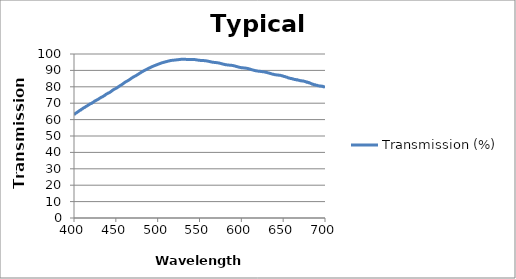
| Category | Transmission (%) |
|---|---|
| 400.0 | 63.127 |
| 401.0 | 63.377 |
| 402.0 | 63.909 |
| 403.0 | 64.16 |
| 404.0 | 64.548 |
| 405.0 | 64.884 |
| 406.0 | 65.27 |
| 407.0 | 65.632 |
| 408.0 | 65.803 |
| 409.0 | 66.292 |
| 410.0 | 66.547 |
| 411.0 | 66.97 |
| 412.0 | 67.303 |
| 413.0 | 67.467 |
| 414.0 | 67.897 |
| 415.0 | 68.181 |
| 416.0 | 68.449 |
| 417.0 | 68.894 |
| 418.0 | 69.125 |
| 419.0 | 69.527 |
| 420.0 | 69.747 |
| 421.0 | 69.894 |
| 422.0 | 70.323 |
| 423.0 | 70.546 |
| 424.0 | 70.991 |
| 425.0 | 71.37 |
| 426.0 | 71.569 |
| 427.0 | 71.92 |
| 428.0 | 72.117 |
| 429.0 | 72.42 |
| 430.0 | 72.76 |
| 431.0 | 73.118 |
| 432.0 | 73.391 |
| 433.0 | 73.743 |
| 434.0 | 73.898 |
| 435.0 | 74.228 |
| 436.0 | 74.546 |
| 437.0 | 74.881 |
| 438.0 | 75.319 |
| 439.0 | 75.653 |
| 440.0 | 75.895 |
| 441.0 | 76.187 |
| 442.0 | 76.399 |
| 443.0 | 76.68 |
| 444.0 | 77.045 |
| 445.0 | 77.421 |
| 446.0 | 77.832 |
| 447.0 | 78.191 |
| 448.0 | 78.493 |
| 449.0 | 78.727 |
| 450.0 | 78.994 |
| 451.0 | 79.269 |
| 452.0 | 79.621 |
| 453.0 | 79.962 |
| 454.0 | 80.346 |
| 455.0 | 80.67 |
| 456.0 | 80.975 |
| 457.0 | 81.298 |
| 458.0 | 81.625 |
| 459.0 | 82.017 |
| 460.0 | 82.39 |
| 461.0 | 82.779 |
| 462.0 | 83.099 |
| 463.0 | 83.372 |
| 464.0 | 83.617 |
| 465.0 | 83.945 |
| 466.0 | 84.251 |
| 467.0 | 84.597 |
| 468.0 | 84.981 |
| 469.0 | 85.337 |
| 470.0 | 85.672 |
| 471.0 | 85.986 |
| 472.0 | 86.263 |
| 473.0 | 86.533 |
| 474.0 | 86.763 |
| 475.0 | 87.115 |
| 476.0 | 87.43 |
| 477.0 | 87.74 |
| 478.0 | 88.11 |
| 479.0 | 88.4 |
| 480.0 | 88.724 |
| 481.0 | 89.053 |
| 482.0 | 89.327 |
| 483.0 | 89.63 |
| 484.0 | 89.906 |
| 485.0 | 90.175 |
| 486.0 | 90.424 |
| 487.0 | 90.691 |
| 488.0 | 90.958 |
| 489.0 | 91.236 |
| 490.0 | 91.464 |
| 491.0 | 91.696 |
| 492.0 | 91.951 |
| 493.0 | 92.22 |
| 494.0 | 92.427 |
| 495.0 | 92.613 |
| 496.0 | 92.853 |
| 497.0 | 93.059 |
| 498.0 | 93.238 |
| 499.0 | 93.438 |
| 500.0 | 93.657 |
| 501.0 | 93.846 |
| 502.0 | 94.025 |
| 503.0 | 94.212 |
| 504.0 | 94.419 |
| 505.0 | 94.602 |
| 506.0 | 94.741 |
| 507.0 | 94.889 |
| 508.0 | 95.026 |
| 509.0 | 95.189 |
| 510.0 | 95.298 |
| 511.0 | 95.43 |
| 512.0 | 95.58 |
| 513.0 | 95.716 |
| 514.0 | 95.827 |
| 515.0 | 95.952 |
| 516.0 | 96.052 |
| 517.0 | 96.124 |
| 518.0 | 96.185 |
| 519.0 | 96.232 |
| 520.0 | 96.273 |
| 521.0 | 96.327 |
| 522.0 | 96.398 |
| 523.0 | 96.44 |
| 524.0 | 96.501 |
| 525.0 | 96.558 |
| 526.0 | 96.667 |
| 527.0 | 96.696 |
| 528.0 | 96.764 |
| 529.0 | 96.796 |
| 530.0 | 96.79 |
| 531.0 | 96.773 |
| 532.0 | 96.757 |
| 533.0 | 96.734 |
| 534.0 | 96.718 |
| 535.0 | 96.672 |
| 536.0 | 96.665 |
| 537.0 | 96.689 |
| 538.0 | 96.677 |
| 539.0 | 96.701 |
| 540.0 | 96.705 |
| 541.0 | 96.717 |
| 542.0 | 96.687 |
| 543.0 | 96.679 |
| 544.0 | 96.626 |
| 545.0 | 96.539 |
| 546.0 | 96.467 |
| 547.0 | 96.359 |
| 548.0 | 96.283 |
| 549.0 | 96.203 |
| 550.0 | 96.169 |
| 551.0 | 96.099 |
| 552.0 | 96.057 |
| 553.0 | 96.03 |
| 554.0 | 96.013 |
| 555.0 | 95.987 |
| 556.0 | 95.938 |
| 557.0 | 95.9 |
| 558.0 | 95.819 |
| 559.0 | 95.731 |
| 560.0 | 95.617 |
| 561.0 | 95.51 |
| 562.0 | 95.416 |
| 563.0 | 95.278 |
| 564.0 | 95.17 |
| 565.0 | 95.052 |
| 566.0 | 94.955 |
| 567.0 | 94.915 |
| 568.0 | 94.84 |
| 569.0 | 94.781 |
| 570.0 | 94.755 |
| 571.0 | 94.652 |
| 572.0 | 94.597 |
| 573.0 | 94.515 |
| 574.0 | 94.421 |
| 575.0 | 94.272 |
| 576.0 | 94.14 |
| 577.0 | 94.007 |
| 578.0 | 93.861 |
| 579.0 | 93.743 |
| 580.0 | 93.607 |
| 581.0 | 93.496 |
| 582.0 | 93.418 |
| 583.0 | 93.358 |
| 584.0 | 93.297 |
| 585.0 | 93.245 |
| 586.0 | 93.192 |
| 587.0 | 93.156 |
| 588.0 | 93.11 |
| 589.0 | 93.03 |
| 590.0 | 92.954 |
| 591.0 | 92.832 |
| 592.0 | 92.719 |
| 593.0 | 92.567 |
| 594.0 | 92.41 |
| 595.0 | 92.286 |
| 596.0 | 92.131 |
| 597.0 | 91.979 |
| 598.0 | 91.87 |
| 599.0 | 91.752 |
| 600.0 | 91.673 |
| 601.0 | 91.604 |
| 602.0 | 91.561 |
| 603.0 | 91.526 |
| 604.0 | 91.464 |
| 605.0 | 91.408 |
| 606.0 | 91.305 |
| 607.0 | 91.219 |
| 608.0 | 91.121 |
| 609.0 | 90.981 |
| 610.0 | 90.819 |
| 611.0 | 90.665 |
| 612.0 | 90.516 |
| 613.0 | 90.352 |
| 614.0 | 90.191 |
| 615.0 | 90.071 |
| 616.0 | 89.929 |
| 617.0 | 89.827 |
| 618.0 | 89.74 |
| 619.0 | 89.636 |
| 620.0 | 89.549 |
| 621.0 | 89.51 |
| 622.0 | 89.459 |
| 623.0 | 89.378 |
| 624.0 | 89.34 |
| 625.0 | 89.24 |
| 626.0 | 89.175 |
| 627.0 | 89.131 |
| 628.0 | 89.019 |
| 629.0 | 88.894 |
| 630.0 | 88.816 |
| 631.0 | 88.657 |
| 632.0 | 88.501 |
| 633.0 | 88.414 |
| 634.0 | 88.225 |
| 635.0 | 88.073 |
| 636.0 | 87.951 |
| 637.0 | 87.738 |
| 638.0 | 87.648 |
| 639.0 | 87.547 |
| 640.0 | 87.403 |
| 641.0 | 87.39 |
| 642.0 | 87.254 |
| 643.0 | 87.142 |
| 644.0 | 87.165 |
| 645.0 | 87.018 |
| 646.0 | 86.977 |
| 647.0 | 86.965 |
| 648.0 | 86.755 |
| 649.0 | 86.702 |
| 650.0 | 86.505 |
| 651.0 | 86.291 |
| 652.0 | 86.264 |
| 653.0 | 85.998 |
| 654.0 | 85.883 |
| 655.0 | 85.758 |
| 656.0 | 85.446 |
| 657.0 | 85.423 |
| 658.0 | 85.196 |
| 659.0 | 85.084 |
| 660.0 | 85.086 |
| 661.0 | 84.808 |
| 662.0 | 84.814 |
| 663.0 | 84.564 |
| 664.0 | 84.431 |
| 665.0 | 84.428 |
| 666.0 | 84.185 |
| 667.0 | 84.282 |
| 668.0 | 84.023 |
| 669.0 | 83.964 |
| 670.0 | 83.854 |
| 671.0 | 83.623 |
| 672.0 | 83.726 |
| 673.0 | 83.472 |
| 674.0 | 83.566 |
| 675.0 | 83.381 |
| 676.0 | 83.209 |
| 677.0 | 83.136 |
| 678.0 | 82.79 |
| 679.0 | 82.865 |
| 680.0 | 82.531 |
| 681.0 | 82.547 |
| 682.0 | 82.281 |
| 683.0 | 82.042 |
| 684.0 | 81.888 |
| 685.0 | 81.492 |
| 686.0 | 81.52 |
| 687.0 | 81.167 |
| 688.0 | 81.275 |
| 689.0 | 80.991 |
| 690.0 | 80.978 |
| 691.0 | 80.77 |
| 692.0 | 80.583 |
| 693.0 | 80.568 |
| 694.0 | 80.379 |
| 695.0 | 80.536 |
| 696.0 | 80.267 |
| 697.0 | 80.409 |
| 698.0 | 80 |
| 699.0 | 79.968 |
| 700.0 | 79.59 |